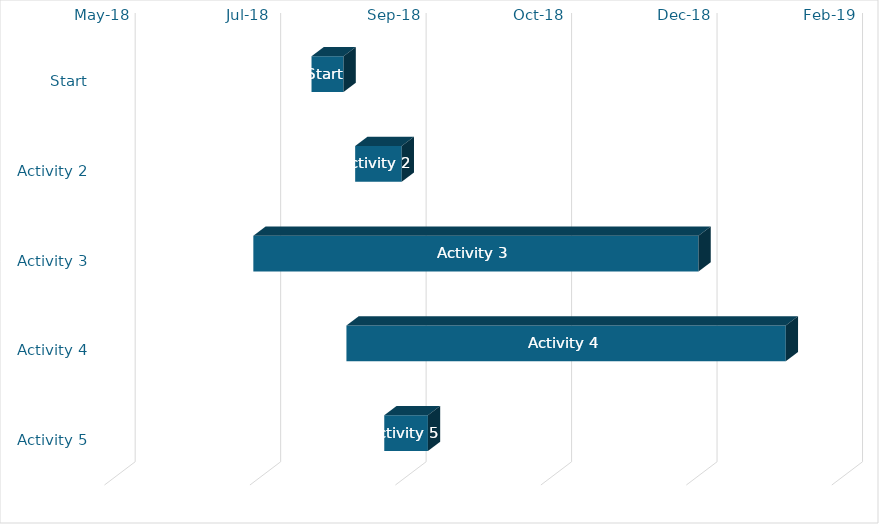
| Category | date | duration |
|---|---|---|
| Start | 8/6/18 | 11 |
| Activity 2 | 8/21/18 | 16 |
| Activity 3 | 7/17/18 | 153 |
| Activity 4 | 8/18/18 | 151 |
| Activity 5 | 8/31/18 | 15 |